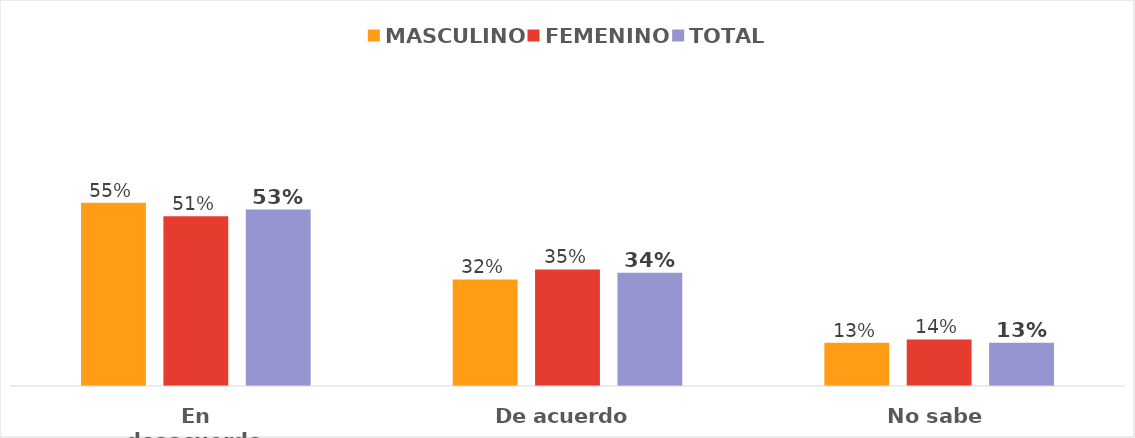
| Category | MASCULINO | FEMENINO | TOTAL |
|---|---|---|---|
| En desacuerdo | 0.55 | 0.51 | 0.53 |
| De acuerdo | 0.32 | 0.35 | 0.34 |
| No sabe | 0.13 | 0.14 | 0.13 |